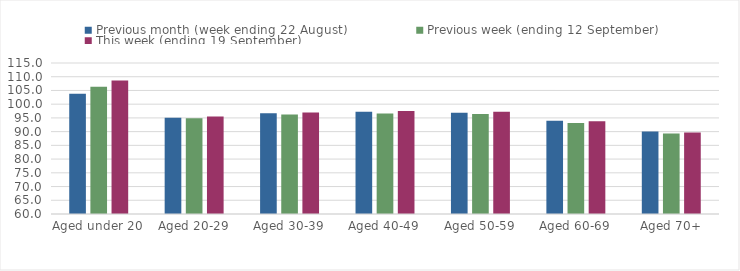
| Category | Previous month (week ending 22 August) | Previous week (ending 12 September) | This week (ending 19 September) |
|---|---|---|---|
| Aged under 20 | 103.77 | 106.33 | 108.59 |
| Aged 20-29 | 95.05 | 94.88 | 95.47 |
| Aged 30-39 | 96.74 | 96.2 | 96.97 |
| Aged 40-49 | 97.24 | 96.6 | 97.56 |
| Aged 50-59 | 96.87 | 96.41 | 97.27 |
| Aged 60-69 | 93.98 | 93.17 | 93.8 |
| Aged 70+ | 90.04 | 89.29 | 89.67 |